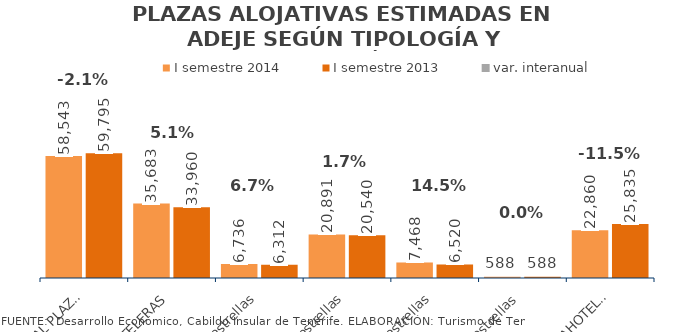
| Category | I semestre 2014 | I semestre 2013 |
|---|---|---|
| TOTAL PLAZAS | 58543 | 59795 |
| HOTELERAS | 35683 | 33960 |
| 5 estrellas | 6736 | 6312 |
| 4 estrellas | 20891 | 20540 |
| 3 estrellas | 7468 | 6520 |
| 1 Y 2 estrellas | 588 | 588 |
| EXTRAHOTELERAS | 22860 | 25835 |